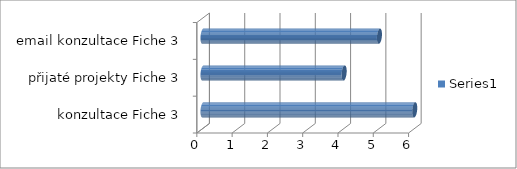
| Category | Series 0 |
|---|---|
|  konzultace Fiche 3 | 6 |
| přijaté projekty Fiche 3 | 4 |
| email konzultace Fiche 3 | 5 |